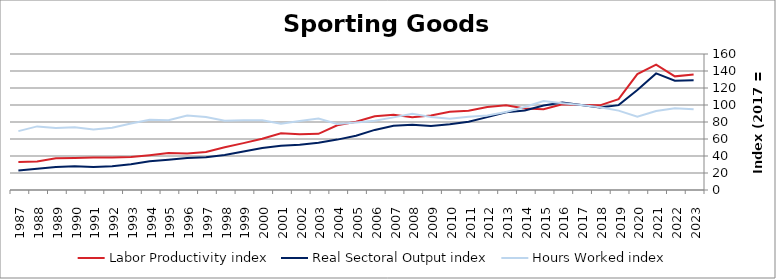
| Category | Labor Productivity index | Real Sectoral Output index | Hours Worked index |
|---|---|---|---|
| 2023.0 | 135.9 | 129.021 | 94.938 |
| 2022.0 | 133.691 | 128.617 | 96.205 |
| 2021.0 | 147.439 | 137.165 | 93.032 |
| 2020.0 | 136.305 | 117.62 | 86.291 |
| 2019.0 | 106.927 | 99.86 | 93.391 |
| 2018.0 | 99.593 | 96.934 | 97.33 |
| 2017.0 | 100 | 100 | 100 |
| 2016.0 | 100.736 | 102.884 | 102.132 |
| 2015.0 | 94.979 | 99.42 | 104.675 |
| 2014.0 | 95.956 | 93.649 | 97.596 |
| 2013.0 | 99.586 | 91.324 | 91.704 |
| 2012.0 | 97.738 | 85.722 | 87.706 |
| 2011.0 | 93.18 | 80.274 | 86.15 |
| 2010.0 | 91.996 | 77.242 | 83.963 |
| 2009.0 | 87.651 | 75.205 | 85.8 |
| 2008.0 | 85.532 | 76.75 | 89.733 |
| 2007.0 | 88.576 | 75.67 | 85.43 |
| 2006.0 | 86.783 | 70.696 | 81.462 |
| 2005.0 | 80.317 | 63.819 | 79.459 |
| 2004.0 | 76.214 | 59.287 | 77.79 |
| 2003.0 | 66.049 | 55.524 | 84.065 |
| 2002.0 | 65.678 | 53.318 | 81.181 |
| 2001.0 | 66.826 | 52.021 | 77.844 |
| 2000.0 | 60.347 | 49.442 | 81.929 |
| 1999.0 | 55.144 | 45.203 | 81.972 |
| 1998.0 | 50.359 | 41.083 | 81.579 |
| 1997.0 | 44.787 | 38.5 | 85.963 |
| 1996.0 | 42.894 | 37.62 | 87.705 |
| 1995.0 | 43.565 | 35.703 | 81.953 |
| 1994.0 | 40.962 | 33.798 | 82.512 |
| 1993.0 | 38.736 | 30.273 | 78.153 |
| 1992.0 | 38.144 | 27.971 | 73.331 |
| 1991.0 | 38.204 | 27.17 | 71.119 |
| 1990.0 | 37.654 | 27.846 | 73.952 |
| 1989.0 | 37.241 | 27.176 | 72.974 |
| 1988.0 | 33.586 | 25.13 | 74.824 |
| 1987.0 | 32.95 | 22.813 | 69.236 |